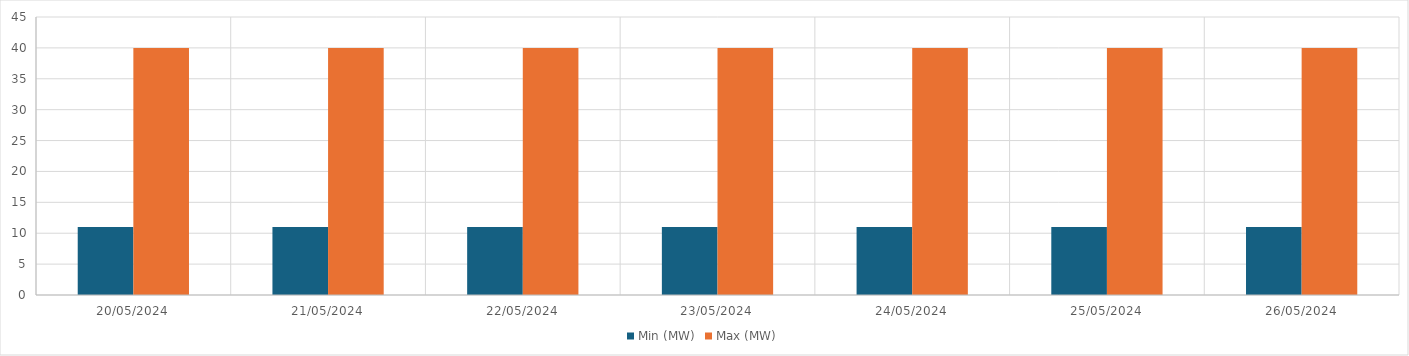
| Category | Min (MW) | Max (MW) |
|---|---|---|
| 20/05/2024 | 11 | 40 |
| 21/05/2024 | 11 | 40 |
| 22/05/2024 | 11 | 40 |
| 23/05/2024 | 11 | 40 |
| 24/05/2024 | 11 | 40 |
| 25/05/2024 | 11 | 40 |
| 26/05/2024 | 11 | 40 |